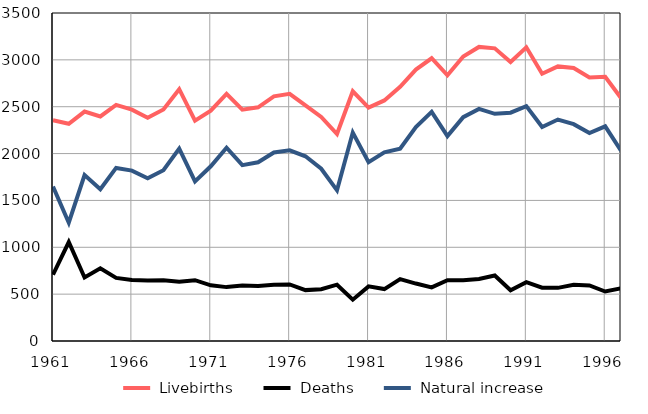
| Category |  Livebirths |  Deaths |  Natural increase |
|---|---|---|---|
| 1961.0 | 2355 | 707 | 1648 |
| 1962.0 | 2318 | 1056 | 1262 |
| 1963.0 | 2448 | 678 | 1770 |
| 1964.0 | 2396 | 776 | 1620 |
| 1965.0 | 2520 | 673 | 1847 |
| 1966.0 | 2469 | 651 | 1818 |
| 1967.0 | 2382 | 645 | 1737 |
| 1968.0 | 2470 | 647 | 1823 |
| 1969.0 | 2687 | 633 | 2054 |
| 1970.0 | 2352 | 649 | 1703 |
| 1971.0 | 2458 | 594 | 1864 |
| 1972.0 | 2637 | 575 | 2062 |
| 1973.0 | 2468 | 591 | 1877 |
| 1974.0 | 2494 | 587 | 1907 |
| 1975.0 | 2611 | 599 | 2012 |
| 1976.0 | 2637 | 603 | 2034 |
| 1977.0 | 2514 | 543 | 1971 |
| 1978.0 | 2391 | 553 | 1838 |
| 1979.0 | 2209 | 601 | 1608 |
| 1980.0 | 2665 | 441 | 2224 |
| 1981.0 | 2491 | 583 | 1908 |
| 1982.0 | 2567 | 554 | 2013 |
| 1983.0 | 2712 | 660 | 2052 |
| 1984.0 | 2896 | 613 | 2283 |
| 1985.0 | 3017 | 572 | 2445 |
| 1986.0 | 2835 | 649 | 2186 |
| 1987.0 | 3036 | 647 | 2389 |
| 1988.0 | 3138 | 661 | 2477 |
| 1989.0 | 3123 | 699 | 2424 |
| 1990.0 | 2977 | 541 | 2436 |
| 1991.0 | 3134 | 628 | 2506 |
| 1992.0 | 2852 | 569 | 2283 |
| 1993.0 | 2930 | 567 | 2363 |
| 1994.0 | 2914 | 600 | 2314 |
| 1995.0 | 2812 | 593 | 2219 |
| 1996.0 | 2819 | 528 | 2291 |
| 1997.0 | 2593 | 562 | 2031 |